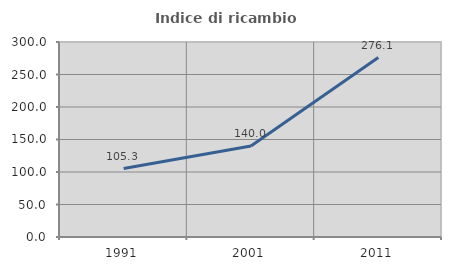
| Category | Indice di ricambio occupazionale  |
|---|---|
| 1991.0 | 105.263 |
| 2001.0 | 140 |
| 2011.0 | 276.106 |